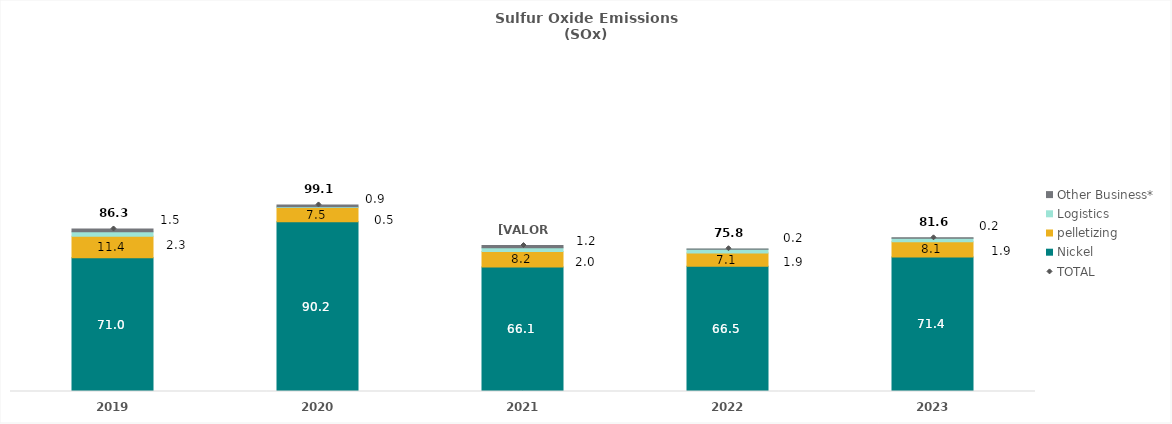
| Category | Nickel | pelletizing | Logistics | Other Business* |
|---|---|---|---|---|
| 2019.0 | 70.969 | 11.446 | 2.345 | 1.533 |
| 2020.0 | 90.199 | 7.489 | 0.466 | 0.914 |
| 2021.0 | 66.104 | 8.2 | 2.039 | 1.167 |
| 2022.0 | 66.5 | 7.1 | 1.906 | 0.2 |
| 2023.0 | 71.407 | 8.076 | 1.883 | 0.233 |